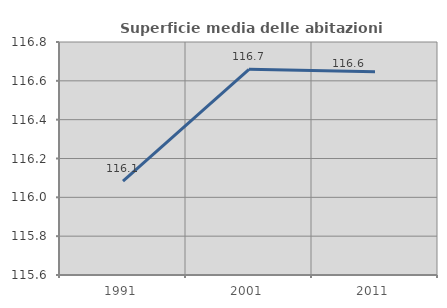
| Category | Superficie media delle abitazioni occupate |
|---|---|
| 1991.0 | 116.083 |
| 2001.0 | 116.659 |
| 2011.0 | 116.647 |